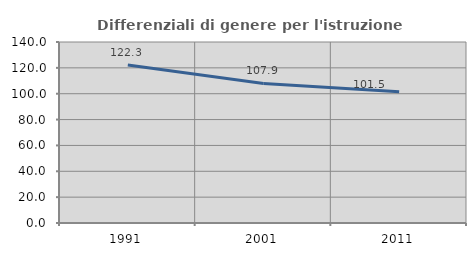
| Category | Differenziali di genere per l'istruzione superiore |
|---|---|
| 1991.0 | 122.282 |
| 2001.0 | 107.922 |
| 2011.0 | 101.543 |